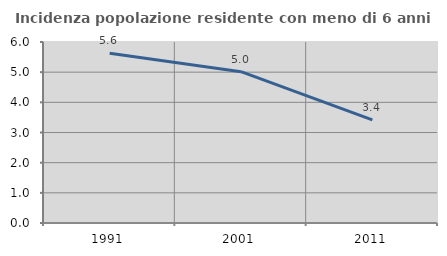
| Category | Incidenza popolazione residente con meno di 6 anni |
|---|---|
| 1991.0 | 5.63 |
| 2001.0 | 5.017 |
| 2011.0 | 3.42 |